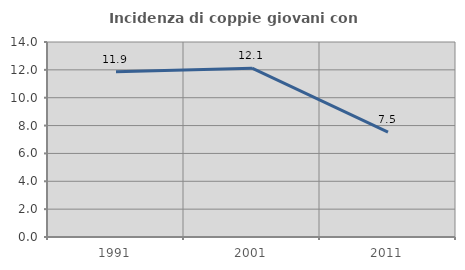
| Category | Incidenza di coppie giovani con figli |
|---|---|
| 1991.0 | 11.864 |
| 2001.0 | 12.121 |
| 2011.0 | 7.531 |